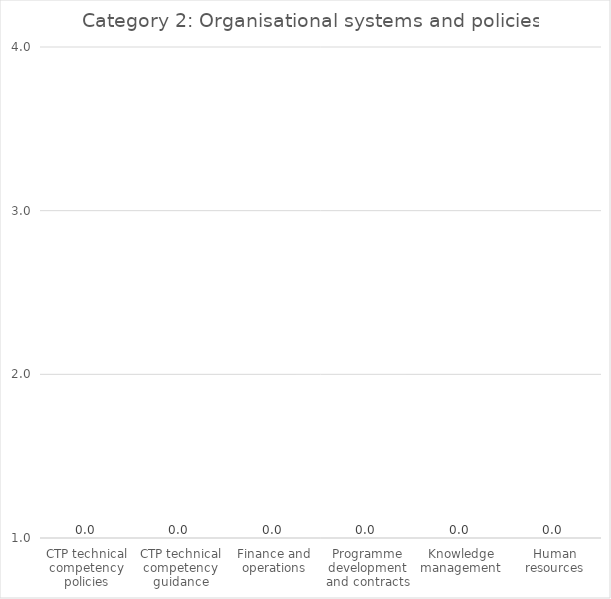
| Category |   Category 2: Organisational systems and policies |
|---|---|
| CTP technical competency policies | 0 |
| CTP technical competency guidance | 0 |
| Finance and operations | 0 |
| Programme development and contracts | 0 |
| Knowledge management | 0 |
| Human resources | 0 |